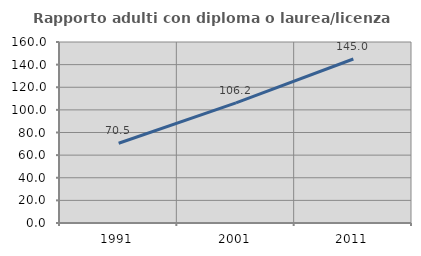
| Category | Rapporto adulti con diploma o laurea/licenza media  |
|---|---|
| 1991.0 | 70.502 |
| 2001.0 | 106.237 |
| 2011.0 | 144.985 |